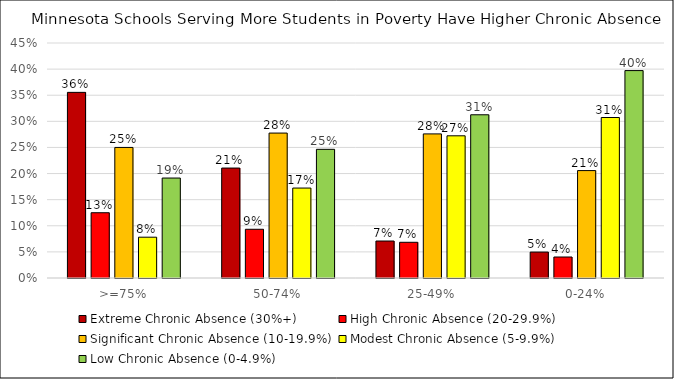
| Category | Extreme Chronic Absence (30%+) | High Chronic Absence (20-29.9%) | Significant Chronic Absence (10-19.9%) | Modest Chronic Absence (5-9.9%) | Low Chronic Absence (0-4.9%) |
|---|---|---|---|---|---|
| >=75% | 0.355 | 0.125 | 0.25 | 0.078 | 0.191 |
| 50-74% | 0.211 | 0.093 | 0.278 | 0.172 | 0.246 |
| 25-49% | 0.071 | 0.068 | 0.276 | 0.272 | 0.313 |
| 0-24% | 0.05 | 0.04 | 0.206 | 0.307 | 0.397 |